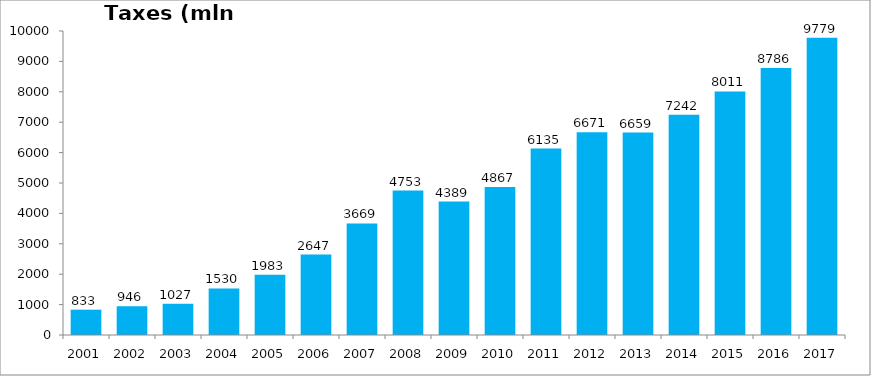
| Category | Taxes (mln GEL) |
|---|---|
| 2001.0 | 833.166 |
| 2002.0 | 946.194 |
| 2003.0 | 1027.441 |
| 2004.0 | 1530.251 |
| 2005.0 | 1982.665 |
| 2006.0 | 2646.541 |
| 2007.0 | 3669.089 |
| 2008.0 | 4752.657 |
| 2009.0 | 4388.874 |
| 2010.0 | 4867.441 |
| 2011.0 | 6134.752 |
| 2012.0 | 6670.969 |
| 2013.0 | 6659.296 |
| 2014.0 | 7242 |
| 2015.0 | 8010.855 |
| 2016.0 | 8786.065 |
| 2017.0 | 9778.948 |